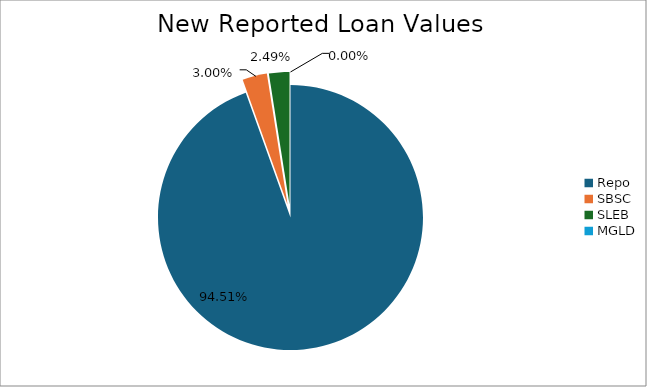
| Category | Series 0 |
|---|---|
| Repo | 12643562.374 |
| SBSC | 400769.287 |
| SLEB | 333171.607 |
| MGLD | 77.604 |